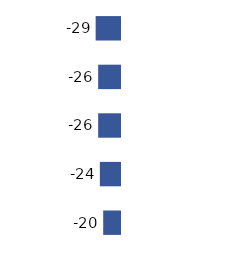
| Category | Series 0 |
|---|---|
| 0 | -29 |
| 1 | -26 |
| 2 | -26 |
| 3 | -24 |
| 4 | -20 |